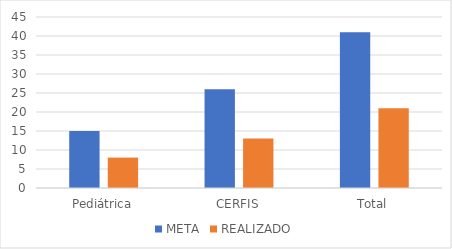
| Category | META | REALIZADO |
|---|---|---|
| Pediátrica | 15 | 8 |
| CERFIS | 26 | 13 |
| Total | 41 | 21 |